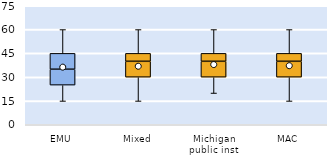
| Category | 25th | 50th | 75th |
|---|---|---|---|
| EMU | 25 | 10 | 10 |
| Mixed | 30 | 10 | 5 |
| Michigan public inst | 30 | 10 | 5 |
| MAC | 30 | 10 | 5 |